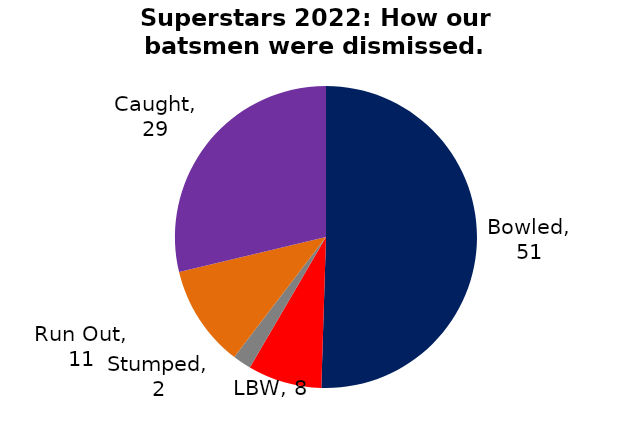
| Category | BATTING |
|---|---|
| Bowled | 51 |
| LBW | 8 |
| Stumped | 2 |
| Run Out | 11 |
| Caught | 29 |